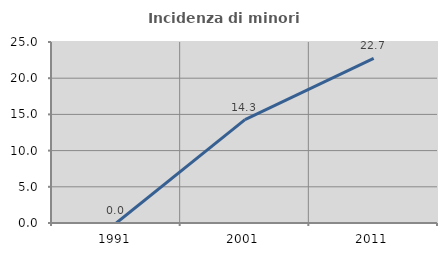
| Category | Incidenza di minori stranieri |
|---|---|
| 1991.0 | 0 |
| 2001.0 | 14.286 |
| 2011.0 | 22.727 |